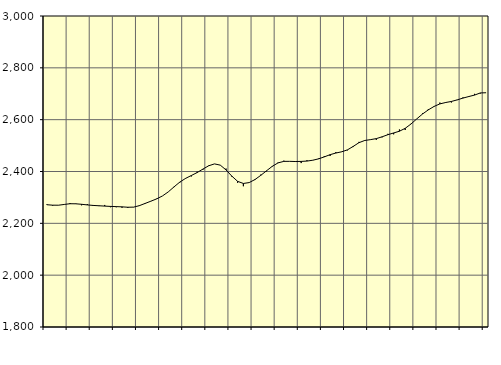
| Category | Piggar | Series 1 |
|---|---|---|
| nan | 2273.8 | 2271.77 |
| 1.0 | 2267.9 | 2270.03 |
| 1.0 | 2269.6 | 2269.9 |
| 1.0 | 2273.1 | 2272.82 |
| nan | 2278.4 | 2275.63 |
| 2.0 | 2276.4 | 2275.38 |
| 2.0 | 2269.6 | 2273.46 |
| 2.0 | 2274.4 | 2271.05 |
| nan | 2267.1 | 2269.06 |
| 3.0 | 2266.6 | 2267.84 |
| 3.0 | 2270.9 | 2266.48 |
| 3.0 | 2262.2 | 2265.31 |
| nan | 2262 | 2264.55 |
| 4.0 | 2260.1 | 2263.58 |
| 4.0 | 2259.2 | 2262.07 |
| 4.0 | 2262.1 | 2262.53 |
| nan | 2269.7 | 2268.18 |
| 5.0 | 2278.4 | 2276.81 |
| 5.0 | 2285.1 | 2285.49 |
| 5.0 | 2295.4 | 2294.43 |
| nan | 2305.7 | 2305.68 |
| 6.0 | 2321.4 | 2321.31 |
| 6.0 | 2339.8 | 2340.73 |
| 6.0 | 2357.2 | 2359.17 |
| nan | 2374.8 | 2373.47 |
| 7.0 | 2380.9 | 2384.58 |
| 7.0 | 2399.4 | 2395.91 |
| 7.0 | 2406.8 | 2409.35 |
| nan | 2423.3 | 2422.09 |
| 8.0 | 2429.3 | 2429.31 |
| 8.0 | 2424.2 | 2424.59 |
| 8.0 | 2411.2 | 2406.08 |
| nan | 2379.9 | 2382.31 |
| 9.0 | 2356.6 | 2362 |
| 9.0 | 2343.1 | 2353.82 |
| 9.0 | 2357.2 | 2357.24 |
| nan | 2367.1 | 2368.87 |
| 10.0 | 2387.9 | 2384.96 |
| 10.0 | 2400.6 | 2402.68 |
| 10.0 | 2418.4 | 2419.98 |
| nan | 2434.7 | 2433.2 |
| 11.0 | 2441.8 | 2439.12 |
| 11.0 | 2438.9 | 2439.17 |
| 11.0 | 2436.8 | 2438.5 |
| nan | 2432.5 | 2438.92 |
| 12.0 | 2443.4 | 2440.23 |
| 12.0 | 2443 | 2443.45 |
| 12.0 | 2450.1 | 2448.75 |
| nan | 2459.3 | 2456.39 |
| 13.0 | 2460 | 2464.92 |
| 13.0 | 2474.8 | 2471.25 |
| 13.0 | 2476.6 | 2475.98 |
| nan | 2481.6 | 2483.48 |
| 14.0 | 2494.4 | 2496.74 |
| 14.0 | 2514.3 | 2511.22 |
| 14.0 | 2520.9 | 2519.71 |
| nan | 2522.4 | 2522.96 |
| 15.0 | 2522.2 | 2526.86 |
| 15.0 | 2531.8 | 2533.87 |
| 15.0 | 2545.3 | 2541.97 |
| nan | 2543.5 | 2548.7 |
| 16.0 | 2562.1 | 2555.41 |
| 16.0 | 2560.1 | 2566.6 |
| 16.0 | 2583.8 | 2583.19 |
| nan | 2602.9 | 2603 |
| 17.0 | 2624.5 | 2621.84 |
| 17.0 | 2640.9 | 2637.82 |
| 17.0 | 2650 | 2651.15 |
| nan | 2665.8 | 2660.83 |
| 18.0 | 2664.7 | 2666.21 |
| 18.0 | 2666.3 | 2670.33 |
| 18.0 | 2675.5 | 2676.4 |
| nan | 2685.8 | 2683.29 |
| 19.0 | 2687.4 | 2689.23 |
| 19.0 | 2699.6 | 2694.84 |
| 19.0 | 2701 | 2703.14 |
| nan | 2703.9 | 2703.89 |